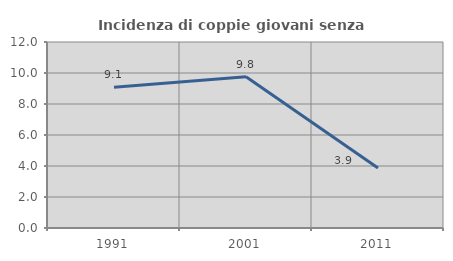
| Category | Incidenza di coppie giovani senza figli |
|---|---|
| 1991.0 | 9.086 |
| 2001.0 | 9.759 |
| 2011.0 | 3.876 |